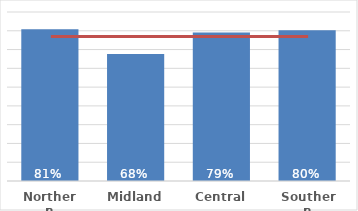
| Category | Dep 5 |
|---|---|
| Northern | 0.809 |
| Midland | 0.676 |
| Central | 0.791 |
| Southern | 0.803 |